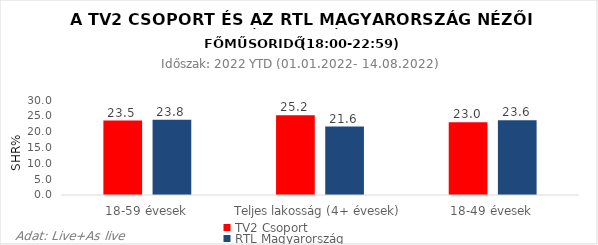
| Category | TV2 Csoport | RTL Magyarország |
|---|---|---|
| 18-59 évesek | 23.5 | 23.8 |
| Teljes lakosság (4+ évesek) | 25.2 | 21.6 |
| 18-49 évesek | 23 | 23.6 |